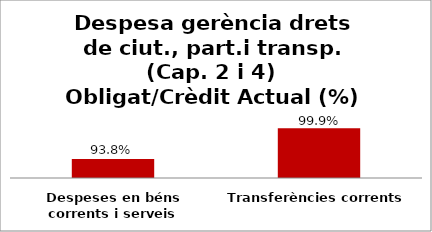
| Category | Series 0 |
|---|---|
| Despeses en béns corrents i serveis | 0.938 |
| Transferències corrents | 0.999 |